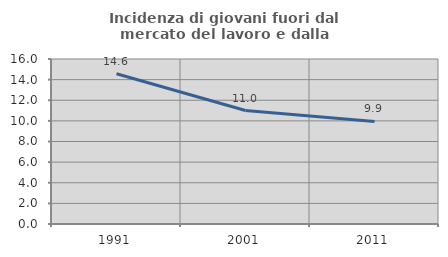
| Category | Incidenza di giovani fuori dal mercato del lavoro e dalla formazione  |
|---|---|
| 1991.0 | 14.57 |
| 2001.0 | 11.004 |
| 2011.0 | 9.945 |